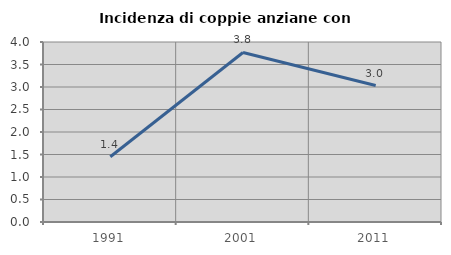
| Category | Incidenza di coppie anziane con figli |
|---|---|
| 1991.0 | 1.449 |
| 2001.0 | 3.767 |
| 2011.0 | 3.032 |